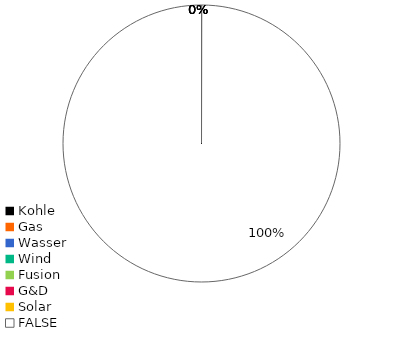
| Category | Series 0 |
|---|---|
| Kohle | 0 |
| Gas | 0 |
| Wasser | 0 |
| Wind | 0 |
| Fusion | 0 |
| G&D | 0 |
| Solar | 0 |
| FALSE | 1 |